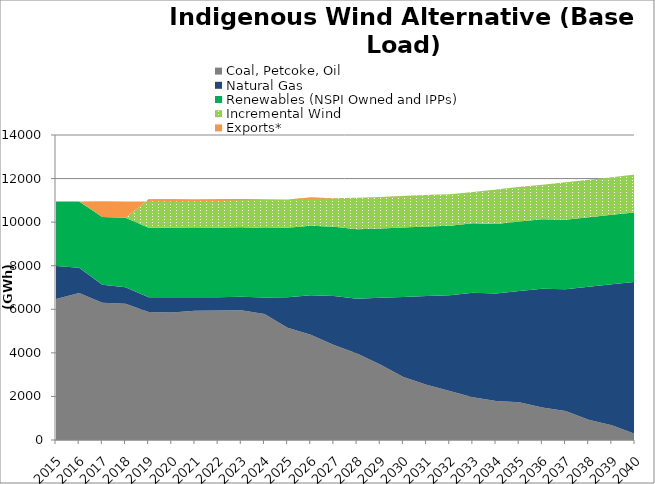
| Category | Coal, Petcoke, Oil | Natural Gas | Renewables (NSPI Owned and IPPs) | Incremental Wind | Exports* |
|---|---|---|---|---|---|
| 2015.0 | 6470.622 | 1521.96 | 2959.036 | 0 | 0 |
| 2016.0 | 6748.166 | 1159.649 | 3041.159 | 0 | 0 |
| 2017.0 | 6305.584 | 816.175 | 3111.572 | 0 | 725.211 |
| 2018.0 | 6258.106 | 756.11 | 3186.595 | 0 | 743.507 |
| 2019.0 | 5871.599 | 684.151 | 3186.595 | 1303.05 | -91.631 |
| 2020.0 | 5848.888 | 705.079 | 3191.673 | 1307.907 | -103.829 |
| 2021.0 | 5935.495 | 611.522 | 3186.595 | 1303.05 | -78.958 |
| 2022.0 | 5945.614 | 610.481 | 3186.595 | 1303.05 | -73.675 |
| 2023.0 | 5959.55 | 616.338 | 3186.595 | 1303.05 | -63.462 |
| 2024.0 | 5779.731 | 762.319 | 3191.673 | 1307.907 | -19.979 |
| 2025.0 | 5150.203 | 1403.245 | 3186.595 | 1303.05 | -3.914 |
| 2026.0 | 4829.196 | 1814.571 | 3186.595 | 1303.05 | -69.556 |
| 2027.0 | 4360.408 | 2247.096 | 3186.595 | 1303.05 | -6.594 |
| 2028.0 | 3973.839 | 2505.732 | 3191.672 | 1448.59 | -5.476 |
| 2029.0 | 3470.571 | 3053.269 | 3186.595 | 1443.21 | -3.39 |
| 2030.0 | 2886.562 | 3679.761 | 3186.595 | 1443.21 | -2.836 |
| 2031.0 | 2540.661 | 4070.956 | 3186.594 | 1443.21 | -2.913 |
| 2032.0 | 2252.41 | 4391.048 | 3191.672 | 1448.59 | -2.789 |
| 2033.0 | 1966.399 | 4792.757 | 3186.595 | 1443.21 | -2.516 |
| 2034.0 | 1785.976 | 4940.932 | 3186.595 | 1583.37 | -3.033 |
| 2035.0 | 1736.117 | 5103.476 | 3186.595 | 1583.37 | -6.395 |
| 2036.0 | 1488.12 | 5449.771 | 3191.672 | 1589.272 | -4.457 |
| 2037.0 | 1330.552 | 5591.42 | 3186.595 | 1723.53 | -4.543 |
| 2038.0 | 928.534 | 6106.169 | 3186.595 | 1723.53 | -3.878 |
| 2039.0 | 673.525 | 6476.442 | 3186.595 | 1723.53 | -3.425 |
| 2040.0 | 280.114 | 6975.821 | 3191.672 | 1729.954 | -3.24 |